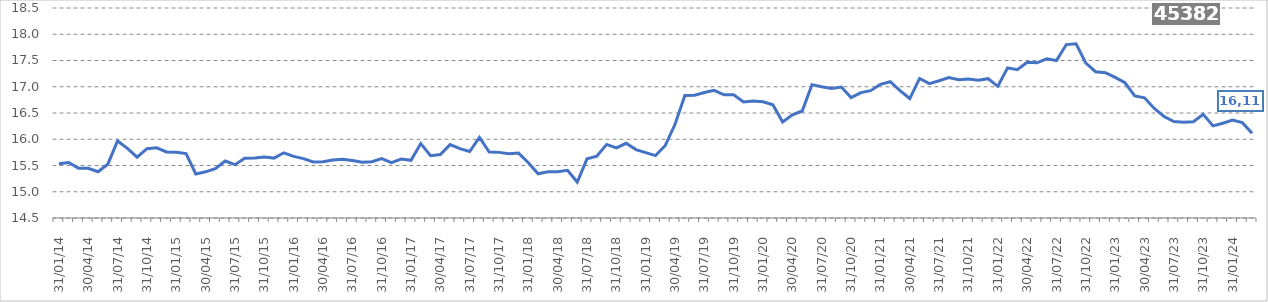
| Category | Series 0 |
|---|---|
| 2014-01-31 | 15533883.53 |
| 2014-02-28 | 15558213.04 |
| 2014-03-31 | 15449382.42 |
| 2014-04-30 | 15447352.42 |
| 2014-05-31 | 15380296.76 |
| 2014-06-30 | 15525078.64 |
| 2014-07-31 | 15967342.14 |
| 2014-08-31 | 15827081.82 |
| 2014-09-30 | 15658759.54 |
| 2014-10-31 | 15819443.54 |
| 2014-11-30 | 15835643.94 |
| 2014-12-31 | 15757733.44 |
| 2015-01-31 | 15754000.94 |
| 2015-02-28 | 15727091.69 |
| 2015-03-31 | 15338940.81 |
| 2015-04-30 | 15379265.81 |
| 2015-05-31 | 15439954.31 |
| 2015-06-30 | 15585542.85 |
| 2015-07-31 | 15515997.85 |
| 2015-08-31 | 15636142.6 |
| 2015-09-30 | 15643447.89 |
| 2015-10-31 | 15659815.39 |
| 2015-11-30 | 15640830.39 |
| 2015-12-31 | 15742020.39 |
| 2016-01-31 | 15674071.73 |
| 2016-02-29 | 15631363.94 |
| 2016-03-31 | 15566744.26 |
| 2016-04-30 | 15571306.36 |
| 2016-05-31 | 15603059.79 |
| 2016-06-30 | 15618584.24 |
| 2016-07-31 | 15593836.74 |
| 2016-08-31 | 15564033.11 |
| 2016-09-30 | 15570830 |
| 2016-10-31 | 15633373 |
| 2016-11-30 | 15555394.67 |
| 2016-12-31 | 15622901.67 |
| 2017-01-31 | 15598671.45 |
| 2017-02-28 | 15918220.45 |
| 2017-03-31 | 15687791.38 |
| 2017-04-30 | 15709119.38 |
| 2017-05-31 | 15898304.87 |
| 2017-06-30 | 15821876.44 |
| 2017-07-31 | 15766232.07 |
| 2017-08-31 | 16035881.95 |
| 2017-09-30 | 15757083.3 |
| 2017-10-31 | 15750065.8 |
| 2017-11-30 | 15724443.3 |
| 2017-12-31 | 15736135.8 |
| 2018-01-31 | 15551986.91 |
| 2018-02-28 | 15341361.16 |
| 2018-03-31 | 15380301.42 |
| 2018-04-30 | 15381878.17 |
| 2018-05-31 | 15407976.38 |
| 2018-06-30 | 15184534.81 |
| 2018-07-31 | 15626882.31 |
| 2018-08-31 | 15675765.81 |
| 2018-09-30 | 15901924.31 |
| 2018-10-31 | 15835083.05 |
| 2018-11-30 | 15923146.05 |
| 2018-12-31 | 15802654.8 |
| 2019-01-31 | 15746218.87 |
| 2019-02-02 | 15689161.7 |
| 2019-03-31 | 15881874.9 |
| 2019-04-30 | 16285184.915 |
| 2019-05-31 | 16832033.16 |
| 2019-06-30 | 16838953 |
| 2019-07-31 | 16890115.94 |
| 2019-08-31 | 16932545.11 |
| 2019-09-30 | 16845772.86 |
| 2019-10-31 | 16845309.88 |
| 2019-11-30 | 16708807.63 |
| 2019-12-31 | 16729589.88 |
| 2020-01-31 | 16714950.19 |
| 2020-02-29 | 16657839.33 |
| 2020-03-31 | 16329033.49 |
| 2020-04-30 | 16464220.89 |
| 2020-05-31 | 16538416.47 |
| 2020-06-30 | 17040525.96 |
| 2020-07-31 | 16999403.46 |
| 2020-08-31 | 16965536.96 |
| 2020-09-30 | 16994099.96 |
| 2020-10-31 | 16793417.81 |
| 2020-11-30 | 16888457.207 |
| 2020-12-31 | 16925687.11 |
| 2021-01-31 | 17046167.406 |
| 2021-02-28 | 17096191.407 |
| 2021-03-31 | 16926361.226 |
| 2021-04-30 | 16775420.23 |
| 2021-05-31 | 17158426.587 |
| 2021-06-30 | 17059589.182 |
| 2021-07-31 | 17114369.88 |
| 2021-08-31 | 17175607.18 |
| 2021-09-30 | 17134822.23 |
| 2021-10-31 | 17147778.73 |
| 2021-11-30 | 17126258.73 |
| 2021-12-31 | 17154011.13 |
| 2022-01-31 | 17008166.03 |
| 2022-02-28 | 17359876.08 |
| 2022-03-31 | 17324526.06 |
| 2022-04-30 | 17465923.89 |
| 2022-05-31 | 17455881.347 |
| 2022-06-30 | 17533049.094 |
| 2022-07-31 | 17500009.34 |
| 2022-08-31 | 17803552.89 |
| 2022-09-30 | 17818669.89 |
| 2022-10-31 | 17451248.04 |
| 2022-11-30 | 17286969.54 |
| 2022-12-31 | 17267911.49 |
| 2023-01-31 | 17177164.159 |
| 2023-02-28 | 17075849.6 |
| 2023-03-31 | 16826490.38 |
| 2023-04-30 | 16789414.88 |
| 2023-05-31 | 16585828.76 |
| 2023-06-30 | 16432946.33 |
| 2023-07-31 | 16338606.48 |
| 2023-08-31 | 16324747.18 |
| 2023-09-30 | 16334992.459 |
| 2023-10-31 | 16475159 |
| 2023-11-30 | 16255170 |
| 2023-12-31 | 16304103.6 |
| 2024-01-31 | 16364911.15 |
| 2024-02-29 | 16316876.15 |
| 2024-03-31 | 16113448.54 |